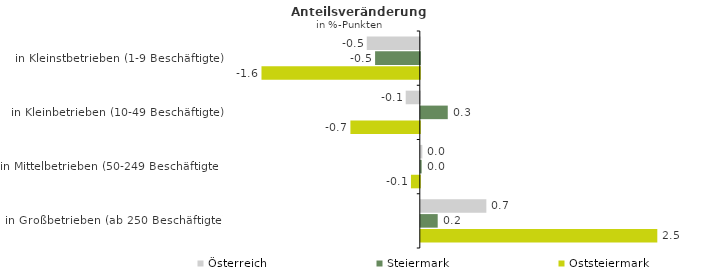
| Category | Österreich | Steiermark | Oststeiermark |
|---|---|---|---|
| in Kleinstbetrieben (1-9 Beschäftigte) | -0.55 | -0.464 | -1.642 |
| in Kleinbetrieben (10-49 Beschäftigte) | -0.146 | 0.28 | -0.72 |
| in Mittelbetrieben (50-249 Beschäftigte) | 0.016 | 0.009 | -0.092 |
| in Großbetrieben (ab 250 Beschäftigte) | 0.68 | 0.175 | 2.453 |